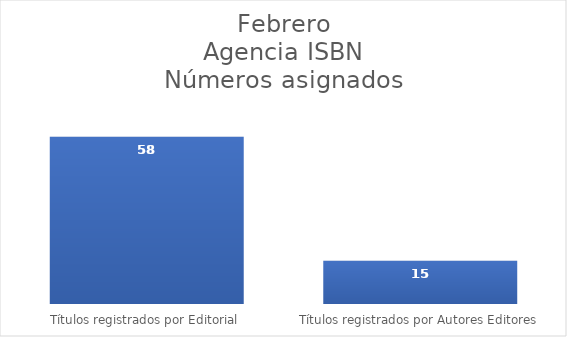
| Category | Series 0 |
|---|---|
| Títulos registrados por Editorial | 58 |
| Títulos registrados por Autores Editores | 15 |